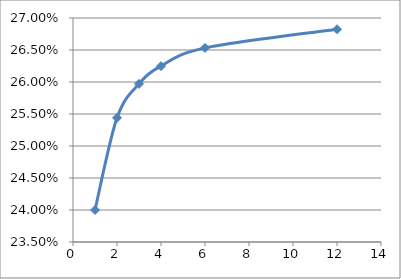
| Category | Series 0 |
|---|---|
| 1.0 | 0.24 |
| 2.0 | 0.254 |
| 3.0 | 0.26 |
| 4.0 | 0.262 |
| 6.0 | 0.265 |
| 12.0 | 0.268 |